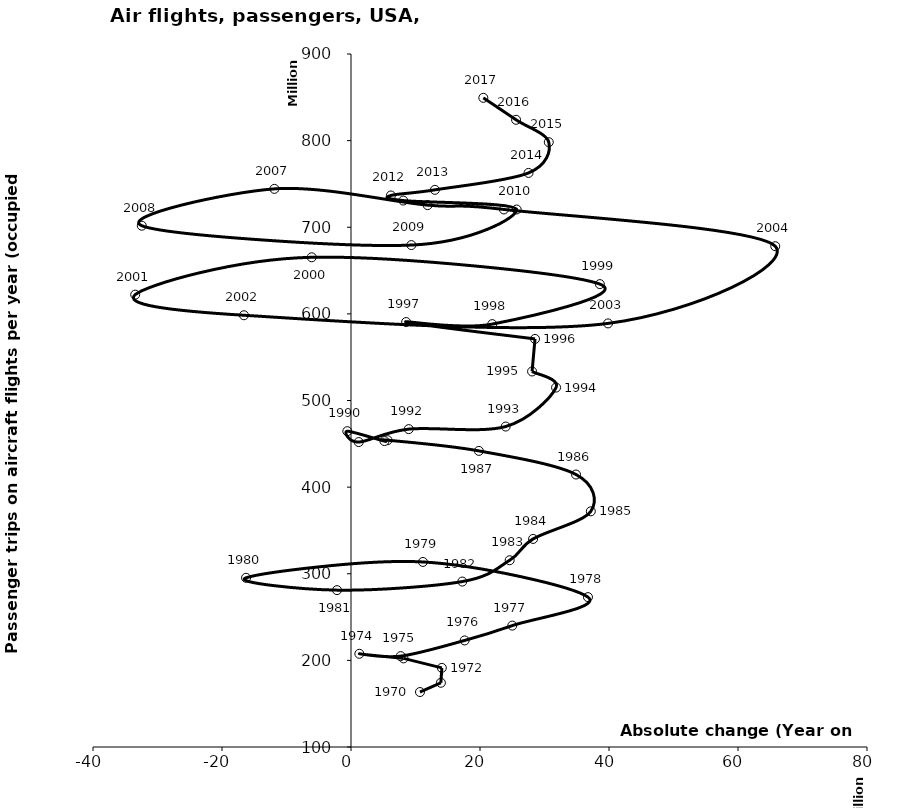
| Category | Series 0 |
|---|---|
| 10694112.0 | 163448992 |
| 13938208.0 | 174143104 |
| 14083048.0 | 191325408 |
| 8143496.0 | 202309200 |
| 1295600.0 | 207612400 |
| 7702448.0 | 204900400 |
| 17622296.0 | 223017296 |
| 25004104.0 | 240144992 |
| 36739504.0 | 273025504 |
| 11151792.0 | 313624000 |
| -16268800.0 | 295329088 |
| -2168240.0 | 281086400 |
| 17256848.0 | 290992608 |
| 24599440.0 | 315600096 |
| 28229504.0 | 340191488 |
| 37181504.0 | 372059104 |
| 34886800.0 | 414554496 |
| 19824208.0 | 441832704 |
| 5664400.0 | 454202912 |
| 5185552.0 | 453161504 |
| -572800.0 | 464574016 |
| 1195488.0 | 452015904 |
| 8955104.0 | 466964992 |
| 23979504.0 | 469926112 |
| 31792992.0 | 514924000 |
| 28074000.0 | 533512096 |
| 28529648.0 | 571072000 |
| 8549440.0 | 590571392 |
| 21896608.0 | 588170880 |
| 38578267.0 | 634364608 |
| -6088381.0 | 665327414 |
| -33458499.5 | 622187846 |
| -16595368.0 | 598410415 |
| 39850096.5 | 588997110 |
| 65775314.0 | 678110608 |
| 23710178.5 | 720547738 |
| 11877286.0 | 725530965 |
| -11875707.0 | 744302310 |
| -32439451.0 | 701779551 |
| 9358724.5 | 679423408 |
| 25686296.0 | 720497000 |
| 8101000.0 | 730796000 |
| 6187500.0 | 736699000 |
| 13005500.0 | 743171000 |
| 27525500.0 | 762710000 |
| 30664500.0 | 798222000 |
| 25590500.0 | 824039000 |
| 20516500.0 | 849403000 |